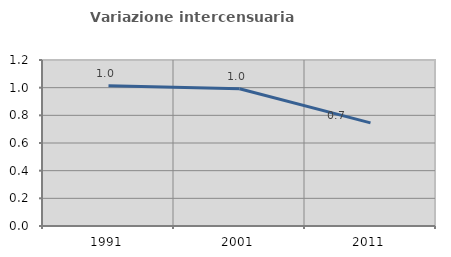
| Category | Variazione intercensuaria annua |
|---|---|
| 1991.0 | 1.013 |
| 2001.0 | 0.992 |
| 2011.0 | 0.745 |